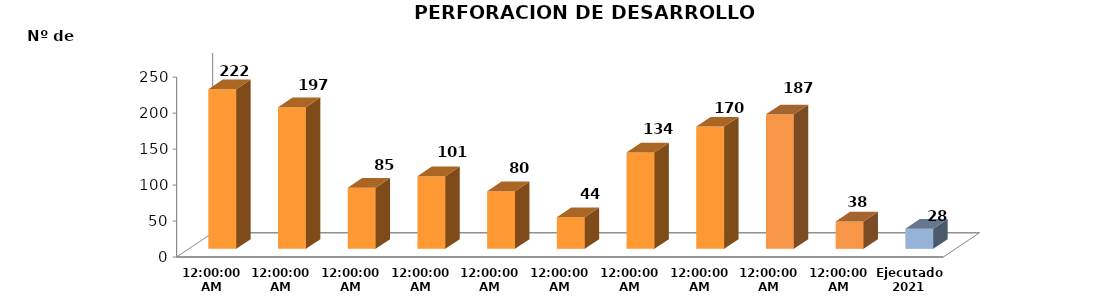
| Category | Series 0 |
|---|---|
| 2011 | 222 |
| 2012 | 197 |
| 2013 | 85 |
| 2014 | 101 |
| 2015 | 80 |
| 2016 | 44 |
| 2017 | 134 |
| 2018 | 170 |
| 2019 | 187 |
| 2020 | 38 |
| Ejecutado
2021 | 28 |